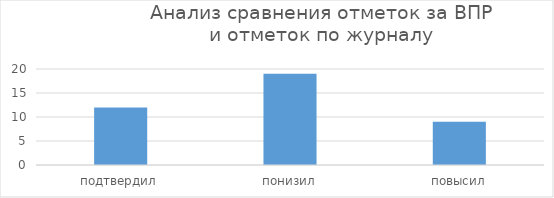
| Category | Series 0 |
|---|---|
| подтвердил | 12 |
| понизил | 19 |
| повысил | 9 |